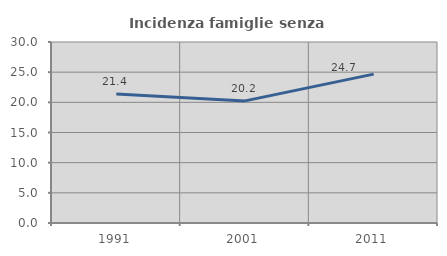
| Category | Incidenza famiglie senza nuclei |
|---|---|
| 1991.0 | 21.367 |
| 2001.0 | 20.24 |
| 2011.0 | 24.674 |